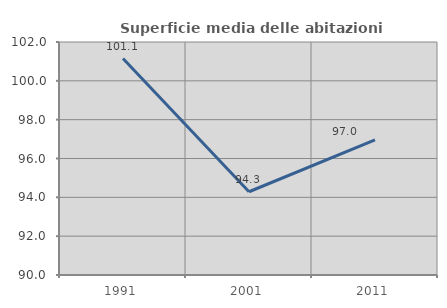
| Category | Superficie media delle abitazioni occupate |
|---|---|
| 1991.0 | 101.146 |
| 2001.0 | 94.288 |
| 2011.0 | 96.957 |